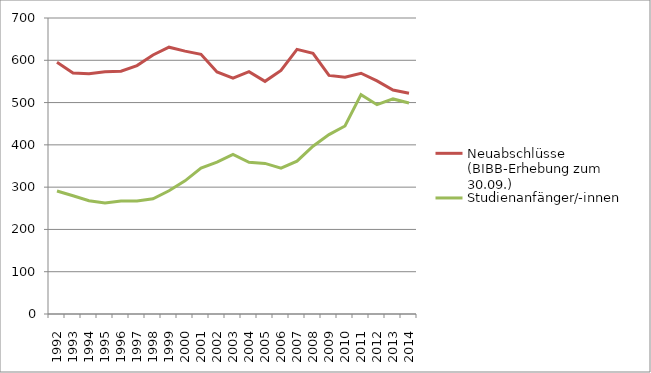
| Category | Neuabschlüsse (BIBB-Erhebung zum 30.09.) | Studienanfänger/-innen |
|---|---|---|
| 1992.0 | 595.21 | 290.81 |
| 1993.0 | 570.12 | 279.63 |
| 1994.0 | 568.17 | 267.95 |
| 1995.0 | 572.77 | 262.407 |
| 1996.0 | 574.33 | 267.469 |
| 1997.0 | 587.51 | 267.445 |
| 1998.0 | 612.528 | 272.473 |
| 1999.0 | 631.014 | 291.447 |
| 2000.0 | 621.693 | 314.956 |
| 2001.0 | 614.238 | 344.83 |
| 2002.0 | 572.322 | 358.946 |
| 2003.0 | 557.634 | 377.504 |
| 2004.0 | 572.979 | 358.87 |
| 2005.0 | 550.179 | 356.076 |
| 2006.0 | 576.153 | 344.967 |
| 2007.0 | 625.884 | 361.459 |
| 2008.0 | 616.341 | 396.8 |
| 2009.0 | 564.306 | 424.273 |
| 2010.0 | 559.959 | 444.719 |
| 2011.0 | 569.379 | 518.748 |
| 2012.0 | 551.259 | 495.088 |
| 2013.0 | 529.542 | 508.621 |
| 2014.0 | 522.231 | 498.924 |